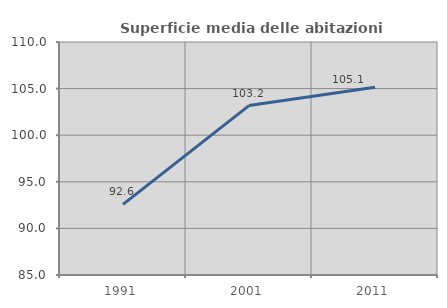
| Category | Superficie media delle abitazioni occupate |
|---|---|
| 1991.0 | 92.579 |
| 2001.0 | 103.178 |
| 2011.0 | 105.144 |